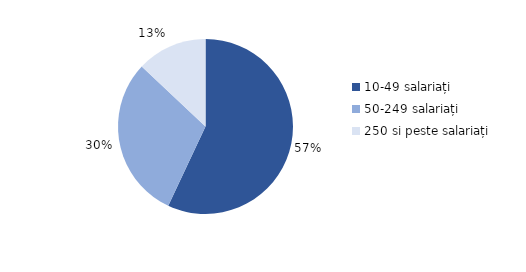
| Category | Series 0 |
|---|---|
| 10-49 salariați | 0.57 |
| 50-249 salariați | 0.3 |
| 250 si peste salariați | 0.13 |